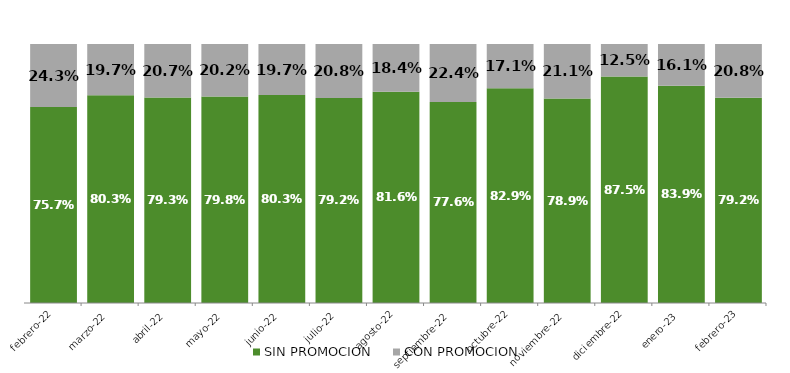
| Category | SIN PROMOCION   | CON PROMOCION   |
|---|---|---|
| 2022-02-01 | 0.757 | 0.243 |
| 2022-03-01 | 0.803 | 0.197 |
| 2022-04-01 | 0.793 | 0.207 |
| 2022-05-01 | 0.798 | 0.202 |
| 2022-06-01 | 0.803 | 0.197 |
| 2022-07-01 | 0.792 | 0.208 |
| 2022-08-01 | 0.816 | 0.184 |
| 2022-09-01 | 0.776 | 0.224 |
| 2022-10-01 | 0.829 | 0.171 |
| 2022-11-01 | 0.789 | 0.211 |
| 2022-12-01 | 0.875 | 0.125 |
| 2023-01-01 | 0.839 | 0.161 |
| 2023-02-01 | 0.792 | 0.208 |